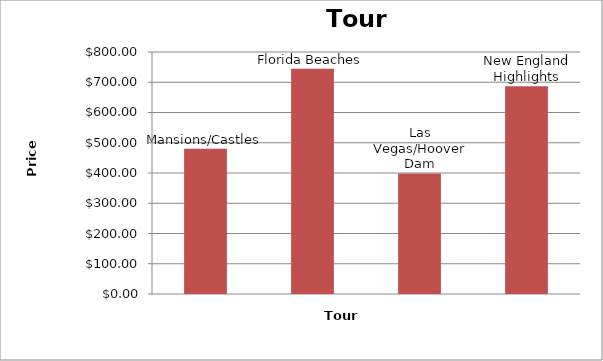
| Category | Price |
|---|---|
| Mansions/Castles | 480 |
| Florida Beaches | 745 |
| Las Vegas/Hoover Dam | 398 |
| New England Highlights | 687 |